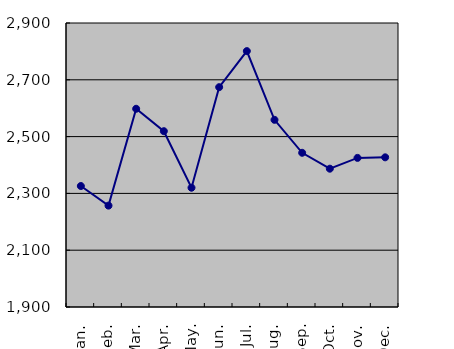
| Category | Series 0 |
|---|---|
| Jan. | 2326 |
| Feb. | 2257 |
| Mar. | 2598 |
| Apr. | 2519 |
| May. | 2320 |
| Jun. | 2674 |
| Jul. | 2801 |
| Aug. | 2559 |
| Sep. | 2443 |
| Oct. | 2387 |
| Nov. | 2425 |
| Dec. | 2427 |